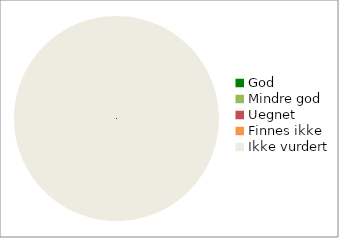
| Category | Series 0 |
|---|---|
| God | 0 |
| Mindre god | 0 |
| Uegnet | 0 |
| Finnes ikke | 0 |
| Ikke vurdert | 33 |